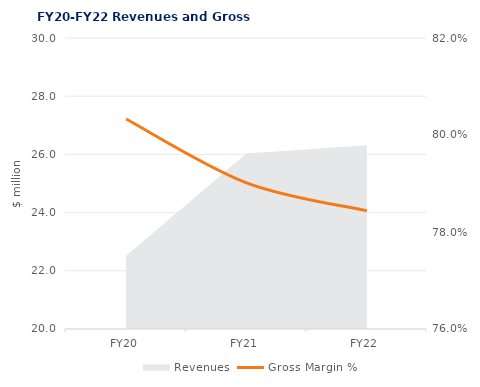
| Category | Gross Margin % |
|---|---|
| FY20 | 0.803 |
| FY21 | 0.79 |
| FY22 | 0.784 |